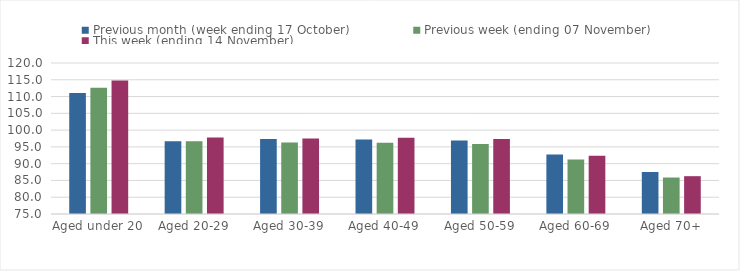
| Category | Previous month (week ending 17 October) | Previous week (ending 07 November) | This week (ending 14 November) |
|---|---|---|---|
| Aged under 20 | 111.07 | 112.66 | 114.77 |
| Aged 20-29 | 96.67 | 96.71 | 97.77 |
| Aged 30-39 | 97.35 | 96.29 | 97.53 |
| Aged 40-49 | 97.23 | 96.26 | 97.7 |
| Aged 50-59 | 96.9 | 95.84 | 97.35 |
| Aged 60-69 | 92.7 | 91.23 | 92.38 |
| Aged 70+ | 87.51 | 85.87 | 86.27 |